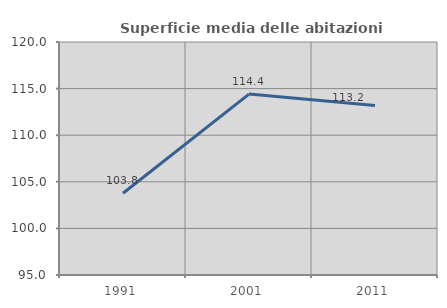
| Category | Superficie media delle abitazioni occupate |
|---|---|
| 1991.0 | 103.772 |
| 2001.0 | 114.414 |
| 2011.0 | 113.175 |